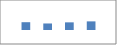
| Category | Data4 |
|---|---|
| 0 | 104 |
| 1 | 87 |
| 2 | 102 |
| 3 | 115 |